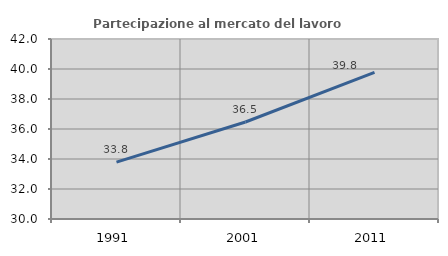
| Category | Partecipazione al mercato del lavoro  femminile |
|---|---|
| 1991.0 | 33.788 |
| 2001.0 | 36.466 |
| 2011.0 | 39.773 |